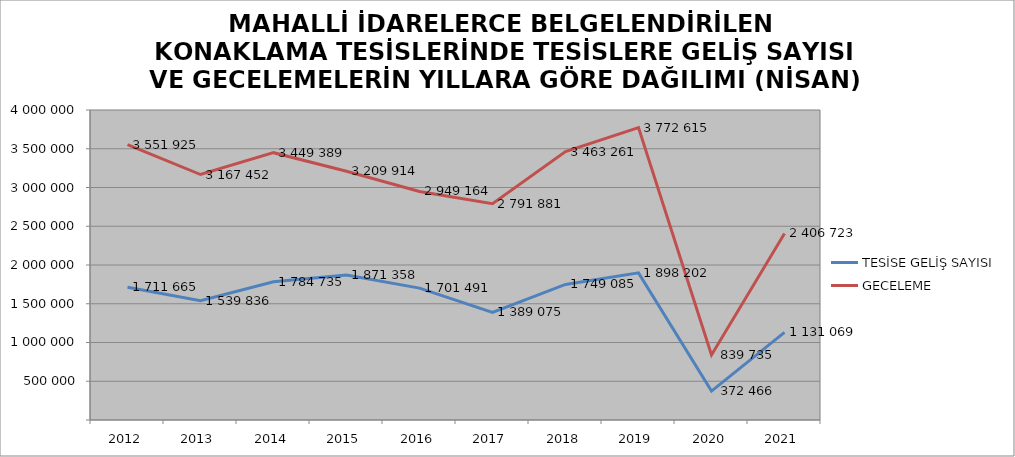
| Category | TESİSE GELİŞ SAYISI | GECELEME |
|---|---|---|
| 2012 | 1711665 | 3551925 |
| 2013 | 1539836 | 3167452 |
| 2014 | 1784735 | 3449389 |
| 2015 | 1871358 | 3209914 |
| 2016 | 1701491 | 2949164 |
| 2017 | 1389075 | 2791881 |
| 2018 | 1749085 | 3463261 |
| 2019 | 1898202 | 3772615 |
| 2020 | 372466 | 839735 |
| 2021 | 1131069 | 2406723 |